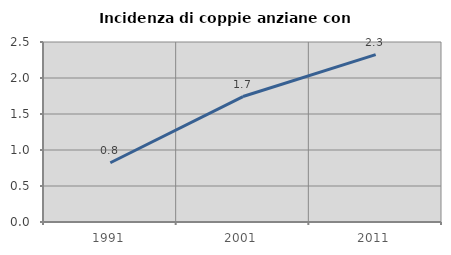
| Category | Incidenza di coppie anziane con figli |
|---|---|
| 1991.0 | 0.823 |
| 2001.0 | 1.742 |
| 2011.0 | 2.324 |